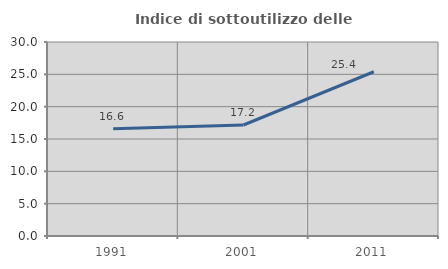
| Category | Indice di sottoutilizzo delle abitazioni  |
|---|---|
| 1991.0 | 16.584 |
| 2001.0 | 17.165 |
| 2011.0 | 25.399 |